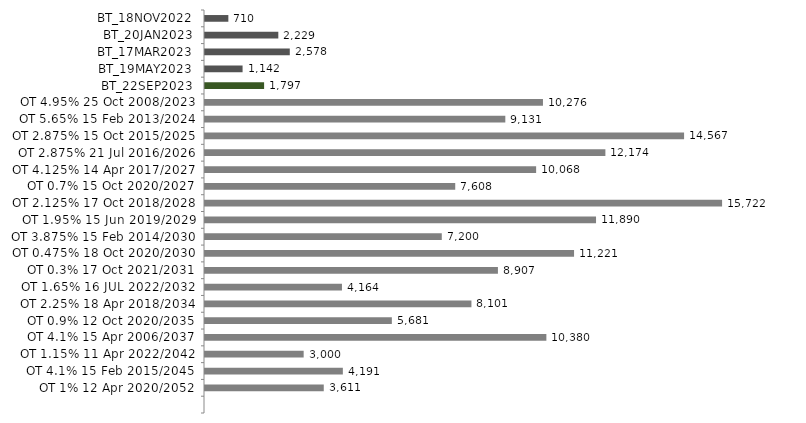
| Category | Series 0 |
|---|---|
| BT_18NOV2022 | 710.044 |
| BT_20JAN2023 | 2229.005 |
| BT_17MAR2023 | 2577.943 |
| BT_19MAY2023 | 1142.487 |
| BT_22SEP2023 | 1797.035 |
| OT 4.95% 25 Oct 2008/2023 | 10275.734 |
| OT 5.65% 15 Feb 2013/2024 | 9131.355 |
| OT 2.875% 15 Oct 2015/2025 | 14566.701 |
| OT 2.875% 21 Jul 2016/2026 | 12173.946 |
| OT 4.125% 14 Apr 2017/2027 | 10068.169 |
| OT 0.7% 15 Oct 2020/2027 | 7608.456 |
| OT 2.125% 17 Oct 2018/2028 | 15722.387 |
| OT 1.95% 15 Jun 2019/2029 | 11889.72 |
| OT 3.875% 15 Feb 2014/2030 | 7199.513 |
| OT 0.475% 18 Oct 2020/2030 | 11221.218 |
| OT 0.3% 17 Oct 2021/2031 | 8906.526 |
| OT 1.65% 16 JUL 2022/2032 | 4164 |
| OT 2.25% 18 Apr 2018/2034 | 8100.85 |
| OT 0.9% 12 Oct 2020/2035 | 5681 |
| OT 4.1% 15 Apr 2006/2037 | 10379.698 |
| OT 1.15% 11 Apr 2022/2042 | 3000 |
| OT 4.1% 15 Feb 2015/2045 | 4191.316 |
| OT 1% 12 Apr 2020/2052 | 3611 |